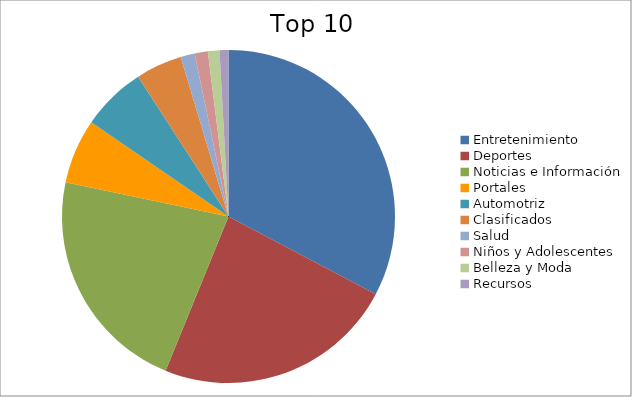
| Category | Series 0 |
|---|---|
| Entretenimiento | 31.94 |
| Deportes | 22.87 |
| Noticias e Información | 21.61 |
| Portales | 6.13 |
| Automotriz | 6.13 |
| Clasificados | 4.39 |
| Salud | 1.33 |
| Niños y Adolescentes | 1.25 |
| Belleza y Moda | 1.1 |
| Recursos | 0.84 |